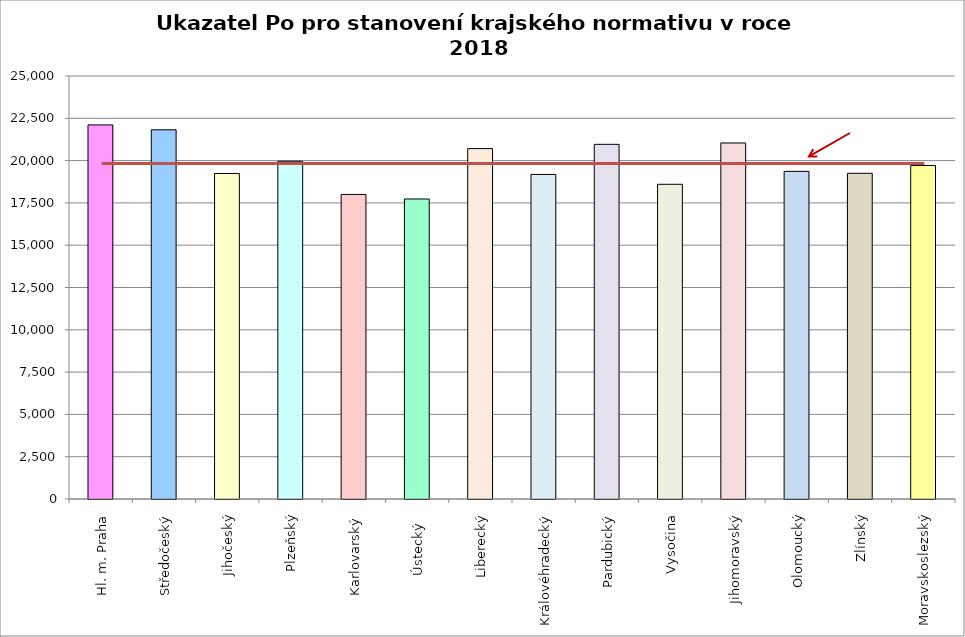
| Category | Series 0 |
|---|---|
| Hl. m. Praha | 22110 |
| Středočeský | 21821 |
| Jihočeský | 19237 |
| Plzeňský | 19962 |
| Karlovarský  | 18000 |
| Ústecký   | 17731 |
| Liberecký | 20710 |
| Královéhradecký | 19182 |
| Pardubický | 20961 |
| Vysočina | 18600 |
| Jihomoravský | 21042 |
| Olomoucký | 19364 |
| Zlínský | 19250 |
| Moravskoslezský | 19710 |